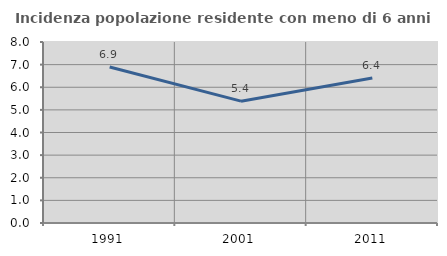
| Category | Incidenza popolazione residente con meno di 6 anni |
|---|---|
| 1991.0 | 6.893 |
| 2001.0 | 5.386 |
| 2011.0 | 6.411 |